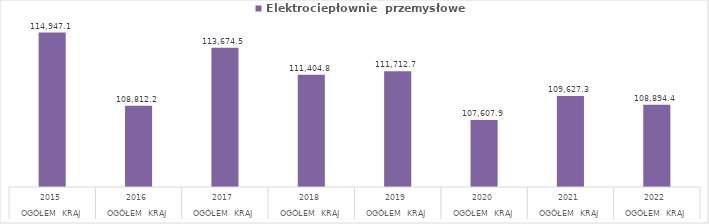
| Category | Elektrociepłownie  przemysłowe |
|---|---|
| 0 | 114947.1 |
| 1 | 108812.2 |
| 2 | 113674.5 |
| 3 | 111404.8 |
| 4 | 111712.7 |
| 5 | 107607.9 |
| 6 | 109627.3 |
| 7 | 108894.4 |